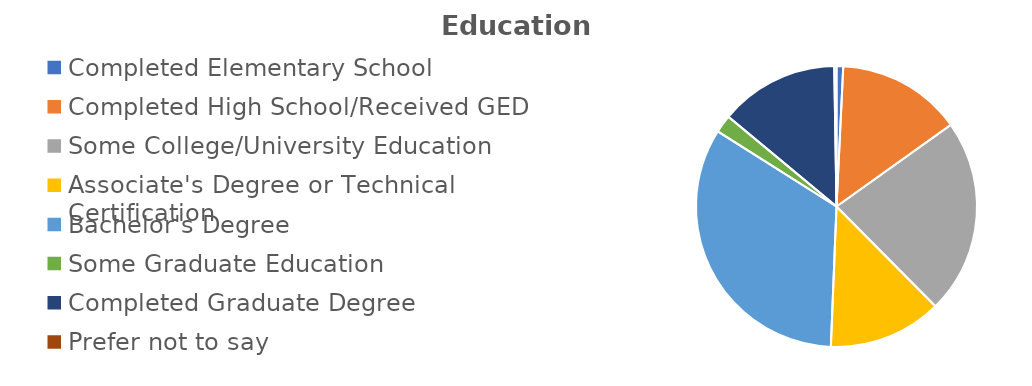
| Category | Series 0 |
|---|---|
| Completed Elementary School | 6 |
| Completed High School/Received GED | 112 |
| Some College/University Education | 175 |
| Associate's Degree or Technical Certification | 102 |
| Bachelor's Degree | 260 |
| Some Graduate Education | 16 |
| Completed Graduate Degree | 107 |
| Prefer not to say | 2 |